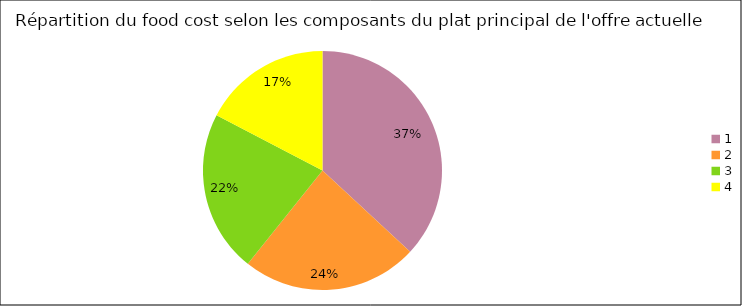
| Category | Series 0 |
|---|---|
| 0 | 0.369 |
| 1 | 0.238 |
| 2 | 0.219 |
| 3 | 0.173 |